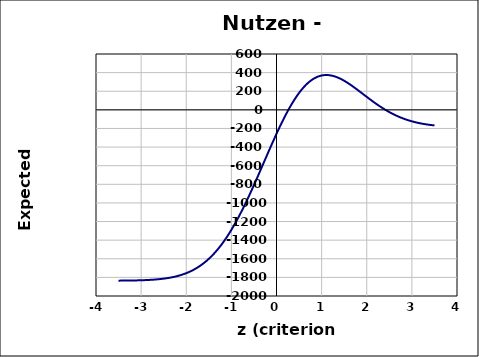
| Category | Series 0 |
|---|---|
| -3.5 | -1834.98 |
| -3.4 | -1834.603 |
| -3.3 | -1834.075 |
| -3.1999999999999997 | -1833.34 |
| -3.0999999999999996 | -1832.33 |
| -2.9999999999999996 | -1830.954 |
| -2.8999999999999995 | -1829.098 |
| -2.7999999999999994 | -1826.622 |
| -2.6999999999999993 | -1823.349 |
| -2.599999999999999 | -1819.07 |
| -2.499999999999999 | -1813.529 |
| -2.399999999999999 | -1806.428 |
| -2.299999999999999 | -1797.42 |
| -2.199999999999999 | -1786.109 |
| -2.0999999999999988 | -1772.051 |
| -1.9999999999999987 | -1754.76 |
| -1.8999999999999986 | -1733.709 |
| -1.7999999999999985 | -1708.346 |
| -1.6999999999999984 | -1678.106 |
| -1.5999999999999983 | -1642.428 |
| -1.4999999999999982 | -1600.775 |
| -1.3999999999999981 | -1552.665 |
| -1.299999999999998 | -1497.689 |
| -1.199999999999998 | -1435.545 |
| -1.0999999999999979 | -1366.067 |
| -0.9999999999999979 | -1289.247 |
| -0.8999999999999979 | -1205.263 |
| -0.7999999999999979 | -1114.494 |
| -0.699999999999998 | -1017.534 |
| -0.599999999999998 | -915.195 |
| -0.499999999999998 | -808.496 |
| -0.399999999999998 | -698.656 |
| -0.29999999999999805 | -587.058 |
| -0.19999999999999804 | -475.22 |
| -0.09999999999999803 | -364.746 |
| 1.970645868709653e-15 | -257.28 |
| 0.10000000000000198 | -154.447 |
| 0.20000000000000198 | -57.798 |
| 0.300000000000002 | 31.247 |
| 0.400000000000002 | 111.445 |
| 0.500000000000002 | 181.781 |
| 0.600000000000002 | 241.494 |
| 0.700000000000002 | 290.107 |
| 0.8000000000000019 | 327.437 |
| 0.9000000000000019 | 353.588 |
| 1.000000000000002 | 368.942 |
| 1.100000000000002 | 374.133 |
| 1.2000000000000022 | 370.009 |
| 1.3000000000000023 | 357.593 |
| 1.4000000000000024 | 338.035 |
| 1.5000000000000024 | 312.563 |
| 1.6000000000000025 | 282.434 |
| 1.7000000000000026 | 248.891 |
| 1.8000000000000027 | 213.12 |
| 1.9000000000000028 | 176.216 |
| 2.0000000000000027 | 139.16 |
| 2.1000000000000028 | 102.795 |
| 2.200000000000003 | 67.82 |
| 2.300000000000003 | 34.787 |
| 2.400000000000003 | 4.1 |
| 2.500000000000003 | -23.972 |
| 2.600000000000003 | -49.282 |
| 2.7000000000000033 | -71.788 |
| 2.8000000000000034 | -91.54 |
| 2.9000000000000035 | -108.655 |
| 3.0000000000000036 | -123.304 |
| 3.1000000000000036 | -135.692 |
| 3.2000000000000037 | -146.046 |
| 3.300000000000004 | -154.601 |
| 3.400000000000004 | -161.59 |
| 3.500000000000004 | -167.237 |